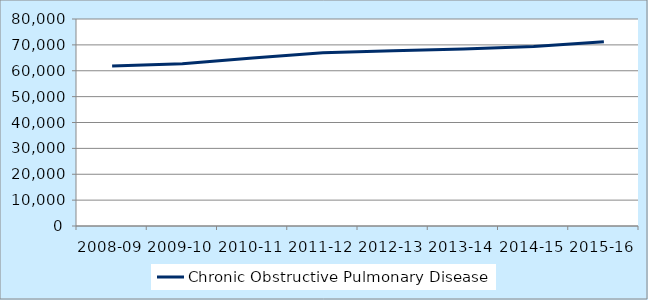
| Category | Chronic Obstructive Pulmonary Disease  |
|---|---|
| 2008-09 | 61851 |
| 2009-10 | 62744 |
| 2010-11 | 64903 |
| 2011-12 | 66951 |
| 2012-13 | 67773 |
| 2013-14 | 68419 |
| 2014-15 | 69385 |
| 2015-16 | 71170 |